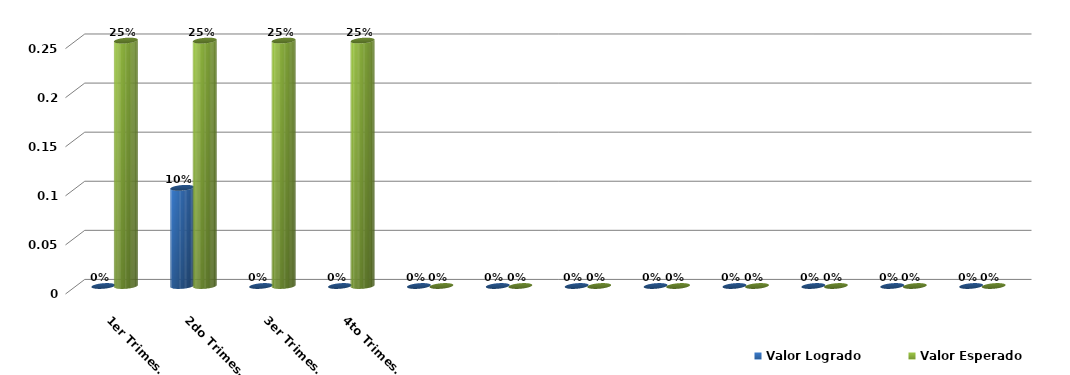
| Category | Valor Logrado | Valor Esperado |
|---|---|---|
| 1er Trimestre | 0 | 0.25 |
| 2do Trimestre | 0.1 | 0.25 |
| 3er Trimestre | 0 | 0.25 |
| 4to Trimestre | 0 | 0.25 |